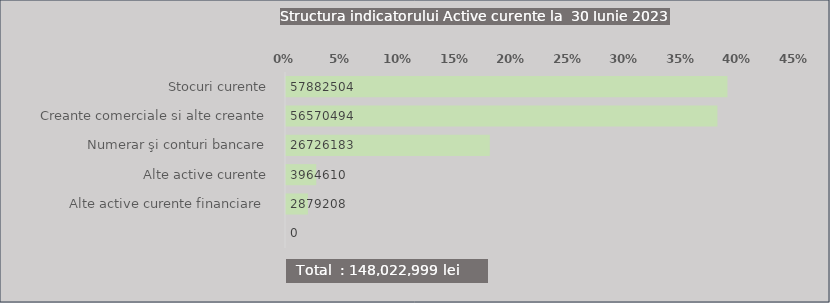
| Category | Series 0 |
|---|---|
| Stocuri curente | 0.391 |
| Creante comerciale si alte creante | 0.382 |
| Numerar şi conturi bancare | 0.181 |
| Alte active curente | 0.027 |
| Alte active curente financiare  | 0.019 |